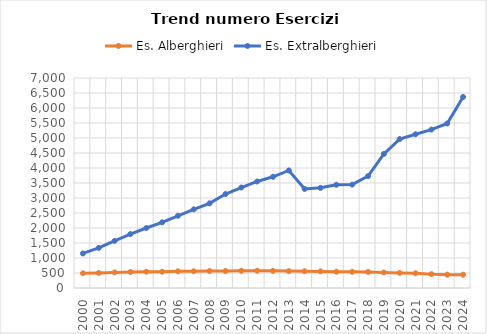
| Category | Es. Alberghieri | Es. Extralberghieri |
|---|---|---|
| 2000.0 | 491 | 1152 |
| 2001.0 | 502 | 1337 |
| 2002.0 | 519 | 1570 |
| 2003.0 | 533 | 1798 |
| 2004.0 | 542 | 2000 |
| 2005.0 | 543 | 2188 |
| 2006.0 | 557 | 2407 |
| 2007.0 | 559 | 2623 |
| 2008.0 | 566 | 2823 |
| 2009.0 | 567 | 3132 |
| 2010.0 | 574 | 3349 |
| 2011.0 | 577 | 3551 |
| 2012.0 | 571 | 3707 |
| 2013.0 | 563 | 3919 |
| 2014.0 | 559 | 3302 |
| 2015.0 | 554 | 3339 |
| 2016.0 | 544 | 3440 |
| 2017.0 | 540 | 3446 |
| 2018.0 | 536 | 3729 |
| 2019.0 | 519 | 4469 |
| 2020.0 | 504 | 4965 |
| 2021.0 | 492 | 5125 |
| 2022.0 | 462 | 5280 |
| 2023.0 | 445 | 5483 |
| 2024.0 | 443 | 6367 |